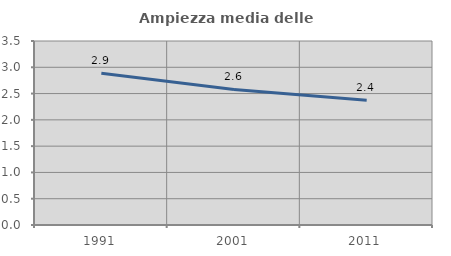
| Category | Ampiezza media delle famiglie |
|---|---|
| 1991.0 | 2.886 |
| 2001.0 | 2.577 |
| 2011.0 | 2.373 |